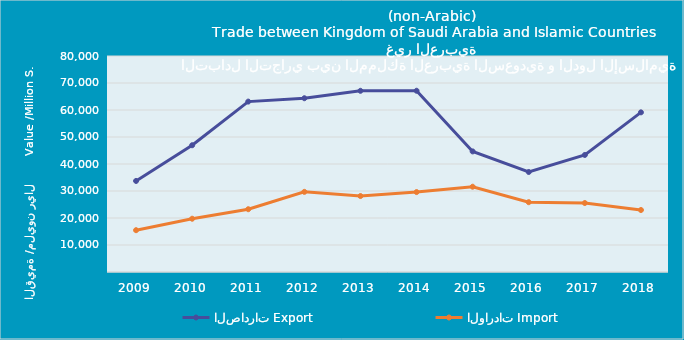
| Category | الصادرات | الواردات |
|---|---|---|
| 2009.0 | 33720337193 | 15481448395 |
| 2010.0 | 46945509903 | 19729149503 |
| 2011.0 | 63112278663 | 23250722106 |
| 2012.0 | 64358948726 | 29682238660 |
| 2013.0 | 67109618510 | 28136010622 |
| 2014.0 | 67130626692 | 29605827322 |
| 2015.0 | 44663887775 | 31584083944 |
| 2016.0 | 37045003272 | 25852606336 |
| 2017.0 | 43350450976 | 25545238820 |
| 2018.0 | 59131737507 | 22957914835 |